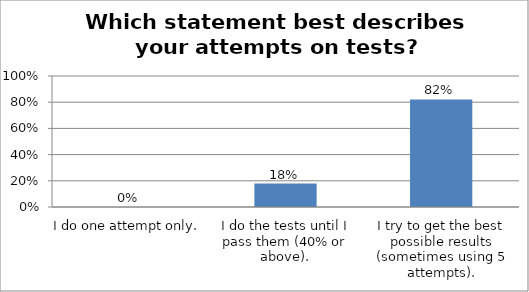
| Category | Series 0 |
|---|---|
| I do one attempt only. | 0 |
| I do the tests until I pass them (40% or above). | 0.179 |
| I try to get the best possible results (sometimes using 5 attempts). | 0.821 |